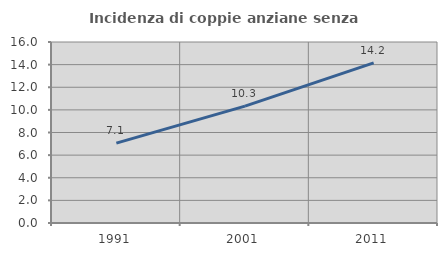
| Category | Incidenza di coppie anziane senza figli  |
|---|---|
| 1991.0 | 7.063 |
| 2001.0 | 10.332 |
| 2011.0 | 14.151 |